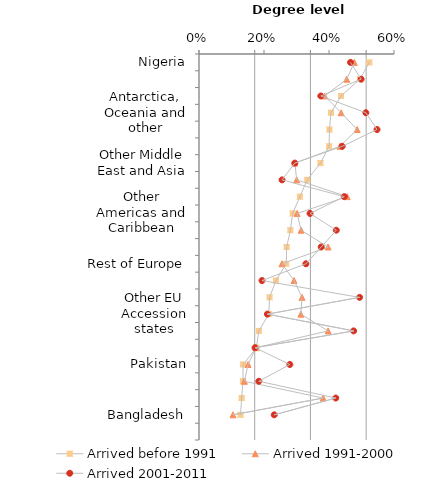
| Category | Series 0 |
|---|---|
| Nigeria | 0.471 |
| United States | 0.462 |
| South Africa | 0.442 |
| Antarctica, Oceania and other | 0.442 |
| Canada | 0.405 |
| France | 0.38 |
| Other Middle East and Asia | 0.348 |
| Other Africa | 0.347 |
| Other EU member states 2001 | 0.338 |
| Other Americas and Caribbean | 0.316 |
| Germany | 0.312 |
| China | 0.255 |
| Rest of Europe | 0.218 |
| Poland | 0.18 |
| India | 0.165 |
| Other EU Accession states | 0.16 |
| Ireland | 0.152 |
| Jamaica | 0.106 |
| Pakistan | 0.104 |
| Portugal  | 0.097 |
| Italy | 0.086 |
| Bangladesh | 0.052 |